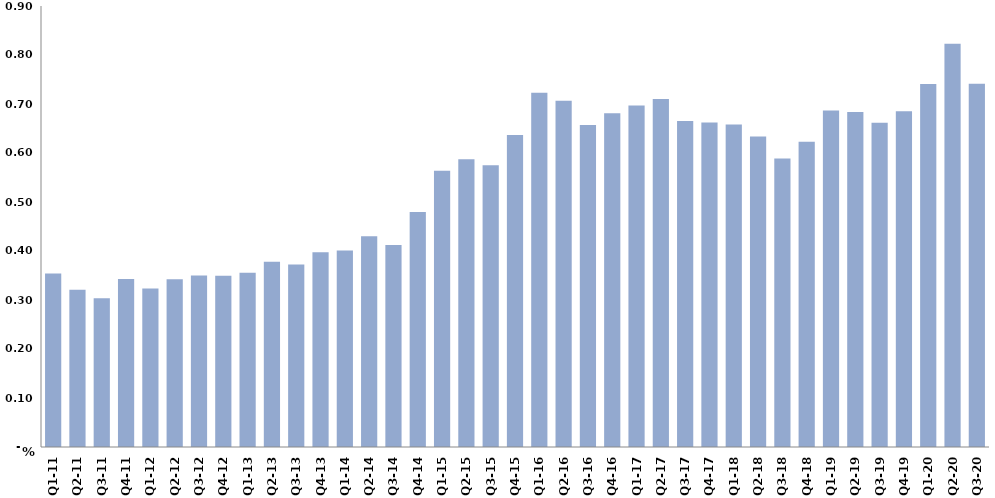
| Category | النسبة المئوية من الناتج المحلي الاجمالي
Percent of Total GDP |
|---|---|
| Q1-11 | 0.354 |
| Q2-11 | 0.321 |
| Q3-11 | 0.303 |
| Q4-11 | 0.343 |
| Q1-12 | 0.323 |
| Q2-12 | 0.342 |
| Q3-12 | 0.35 |
| Q4-12 | 0.349 |
| Q1-13 | 0.356 |
| Q2-13 | 0.378 |
| Q3-13 | 0.372 |
| Q4-13 | 0.398 |
| Q1-14 | 0.401 |
| Q2-14 | 0.43 |
| Q3-14 | 0.412 |
| Q4-14 | 0.48 |
| Q1-15 | 0.564 |
| Q2-15 | 0.587 |
| Q3-15 | 0.575 |
| Q4-15 | 0.637 |
| Q1-16 | 0.723 |
| Q2-16 | 0.707 |
| Q3-16 | 0.657 |
| Q4-16 | 0.681 |
| Q1-17 | 0.697 |
| Q2-17 | 0.71 |
| Q3-17 | 0.665 |
| Q4-17 | 0.662 |
| Q1-18 | 0.658 |
| Q2-18 | 0.634 |
| Q3-18 | 0.589 |
| Q4-18 | 0.623 |
| Q1-19 | 0.687 |
| Q2-19 | 0.683 |
| Q3-19 | 0.662 |
| Q4-19 | 0.685 |
| Q1-20 | 0.741 |
| Q2-20 | 0.823 |
| Q3-20 | 0.741 |